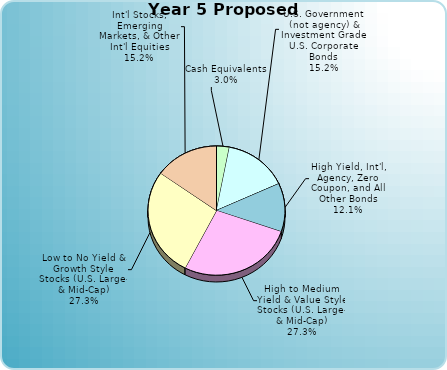
| Category | Series 0 |
|---|---|
| Cash Equivalents | 0.025 |
| U.S. Government (not agency) & Investment Grade U.S. Corporate Bonds | 0.125 |
| Municipal (federally tax-free) Bonds | 0 |
| High Yield, Int'l, Agency, Zero Coupon, and All Other Bonds | 0.1 |
| High to Medium Yield & Value Style Stocks (U.S. Large- & Mid-Cap) | 0.225 |
| Low to No Yield & Growth Style Stocks (U.S. Large- & Mid-Cap) | 0.225 |
| Int'l Stocks, Emerging Markets, & Other Int'l Equities | 0.125 |